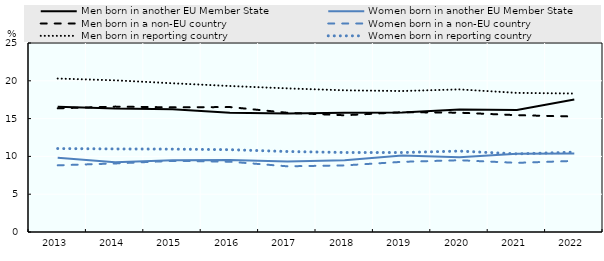
| Category | Men born in another EU Member State | Women born in another EU Member State | Men born in a non-EU country | Women born in a non-EU country | Men born in reporting country | Women born in reporting country |
|---|---|---|---|---|---|---|
| 2013 | 16.577 | 9.831 | 16.36 | 8.819 | 20.3 | 11.037 |
| 2014 | 16.327 | 9.226 | 16.585 | 9.066 | 20.062 | 10.989 |
| 2015 | 16.247 | 9.496 | 16.491 | 9.407 | 19.673 | 10.964 |
| 2016 | 15.761 | 9.525 | 16.527 | 9.299 | 19.312 | 10.889 |
| 2017 | 15.671 | 9.337 | 15.771 | 8.689 | 18.996 | 10.647 |
| 2018 | 15.76 | 9.507 | 15.44 | 8.811 | 18.739 | 10.518 |
| 2019 | 15.791 | 10.12 | 15.851 | 9.281 | 18.65 | 10.512 |
| 2020 | 16.208 | 9.898 | 15.78 | 9.494 | 18.861 | 10.703 |
| 2021 | 16.149 | 10.355 | 15.453 | 9.145 | 18.401 | 10.332 |
| 2022 | 17.524 | 10.393 | 15.273 | 9.408 | 18.317 | 10.564 |